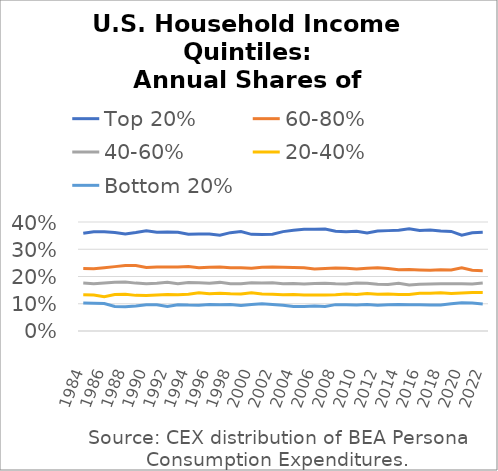
| Category | Top 20% | 60-80% | 40-60% | 20-40% | Bottom 20% |
|---|---|---|---|---|---|
| 1984-01-01 | 0.359 | 0.23 | 0.176 | 0.133 | 0.103 |
| 1985-01-01 | 0.364 | 0.229 | 0.173 | 0.132 | 0.101 |
| 1986-01-01 | 0.365 | 0.232 | 0.176 | 0.126 | 0.101 |
| 1987-01-01 | 0.361 | 0.236 | 0.179 | 0.134 | 0.09 |
| 1988-01-01 | 0.356 | 0.241 | 0.18 | 0.135 | 0.089 |
| 1989-01-01 | 0.362 | 0.24 | 0.176 | 0.131 | 0.092 |
| 1990-01-01 | 0.368 | 0.233 | 0.173 | 0.13 | 0.096 |
| 1991-01-01 | 0.362 | 0.235 | 0.175 | 0.132 | 0.096 |
| 1992-01-01 | 0.364 | 0.235 | 0.179 | 0.134 | 0.09 |
| 1993-01-01 | 0.362 | 0.235 | 0.173 | 0.133 | 0.096 |
| 1994-01-01 | 0.355 | 0.237 | 0.178 | 0.135 | 0.095 |
| 1995-01-01 | 0.356 | 0.232 | 0.177 | 0.14 | 0.095 |
| 1996-01-01 | 0.356 | 0.234 | 0.176 | 0.137 | 0.097 |
| 1997-01-01 | 0.351 | 0.235 | 0.178 | 0.139 | 0.096 |
| 1998-01-01 | 0.361 | 0.232 | 0.173 | 0.136 | 0.098 |
| 1999-01-01 | 0.365 | 0.232 | 0.174 | 0.136 | 0.094 |
| 2000-01-01 | 0.355 | 0.23 | 0.177 | 0.141 | 0.097 |
| 2001-01-01 | 0.354 | 0.234 | 0.176 | 0.136 | 0.1 |
| 2002-01-01 | 0.355 | 0.235 | 0.177 | 0.135 | 0.097 |
| 2003-01-01 | 0.365 | 0.234 | 0.174 | 0.133 | 0.095 |
| 2004-01-01 | 0.37 | 0.233 | 0.174 | 0.134 | 0.09 |
| 2005-01-01 | 0.373 | 0.232 | 0.172 | 0.132 | 0.09 |
| 2006-01-01 | 0.373 | 0.228 | 0.175 | 0.132 | 0.092 |
| 2007-01-01 | 0.374 | 0.229 | 0.175 | 0.132 | 0.09 |
| 2008-01-01 | 0.366 | 0.231 | 0.173 | 0.133 | 0.097 |
| 2009-01-01 | 0.365 | 0.23 | 0.172 | 0.136 | 0.097 |
| 2010-01-01 | 0.366 | 0.228 | 0.176 | 0.134 | 0.096 |
| 2011-01-01 | 0.36 | 0.23 | 0.175 | 0.137 | 0.097 |
| 2012-01-01 | 0.367 | 0.232 | 0.172 | 0.135 | 0.094 |
| 2013-01-01 | 0.368 | 0.229 | 0.171 | 0.136 | 0.096 |
| 2014-01-01 | 0.37 | 0.225 | 0.175 | 0.134 | 0.097 |
| 2015-01-01 | 0.375 | 0.226 | 0.169 | 0.134 | 0.096 |
| 2016-01-01 | 0.369 | 0.224 | 0.172 | 0.138 | 0.097 |
| 2017-01-01 | 0.371 | 0.223 | 0.173 | 0.138 | 0.095 |
| 2018-01-01 | 0.367 | 0.224 | 0.173 | 0.141 | 0.095 |
| 2019-01-01 | 0.365 | 0.224 | 0.173 | 0.138 | 0.1 |
| 2020-01-01 | 0.351 | 0.232 | 0.173 | 0.139 | 0.104 |
| 2021-01-01 | 0.361 | 0.223 | 0.172 | 0.141 | 0.103 |
| 2022-01-01 | 0.362 | 0.222 | 0.176 | 0.141 | 0.099 |